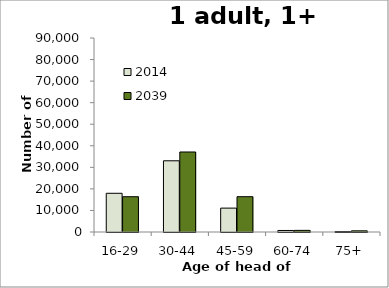
| Category | 2014 | 2039 |
|---|---|---|
| 16-29 | 17961 | 16368 |
| 30-44 | 33033 | 37119 |
| 45-59 | 11082 | 16375 |
| 60-74 | 707 | 757 |
| 75+ | 218 | 537 |